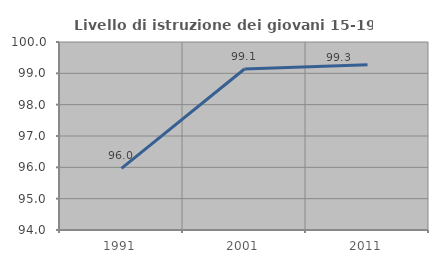
| Category | Livello di istruzione dei giovani 15-19 anni |
|---|---|
| 1991.0 | 95.968 |
| 2001.0 | 99.138 |
| 2011.0 | 99.27 |